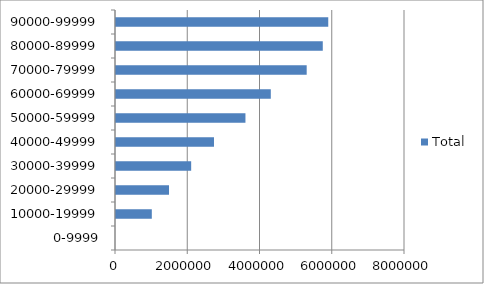
| Category | Total |
|---|---|
| 0-9999 | 0 |
| 10000-19999 | 991398 |
| 20000-29999 | 1467558 |
| 30000-39999 | 2080855 |
| 40000-49999 | 2712620 |
| 50000-59999 | 3583296 |
| 60000-69999 | 4285327 |
| 70000-79999 | 5278706 |
| 80000-89999 | 5724066 |
| 90000-99999 | 5875427 |